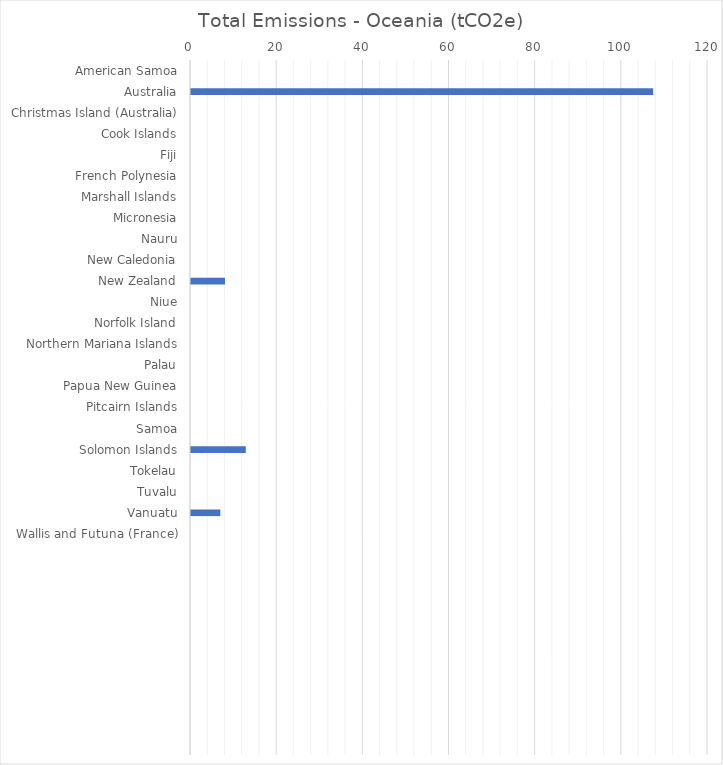
| Category | Total Emissions - Oceania (tCO2e) |
|---|---|
| American Samoa | 0 |
| Australia | 107.275 |
| Christmas Island (Australia) | 0 |
| Cook Islands | 0 |
| Fiji | 0 |
| French Polynesia | 0 |
| Marshall Islands | 0 |
| Micronesia | 0 |
| Nauru | 0 |
| New Caledonia | 0 |
| New Zealand | 7.886 |
| Niue | 0 |
| Norfolk Island | 0 |
| Northern Mariana Islands | 0 |
| Palau | 0 |
| Papua New Guinea | 0 |
| Pitcairn Islands | 0 |
| Samoa | 0 |
| Solomon Islands | 12.716 |
| Tokelau | 0 |
| Tuvalu | 0 |
| Vanuatu | 6.809 |
| Wallis and Futuna (France) | 0 |